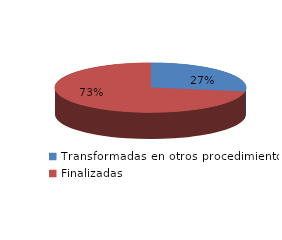
| Category | Series 0 |
|---|---|
| Transformadas en otros procedimientos | 1631 |
| Finalizadas | 4309 |